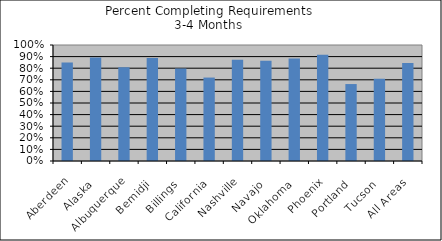
| Category | % Comp. Req. |
|---|---|
| Aberdeen | 0.849 |
| Alaska | 0.892 |
| Albuquerque | 0.808 |
| Bemidji | 0.889 |
| Billings | 0.797 |
| California | 0.719 |
| Nashville | 0.872 |
| Navajo | 0.864 |
| Oklahoma | 0.883 |
| Phoenix | 0.916 |
| Portland | 0.663 |
| Tucson | 0.708 |
|  All Areas | 0.845 |